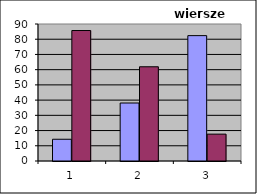
| Category | A | B |
|---|---|---|
| 0 | 14.286 | 85.714 |
| 1 | 38.095 | 61.905 |
| 2 | 82.353 | 17.647 |